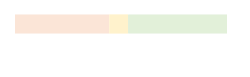
| Category | Series 0 | Series 1 | Series 2 |
|---|---|---|---|
| 0 | 0.667 | 0.133 | 0.7 |